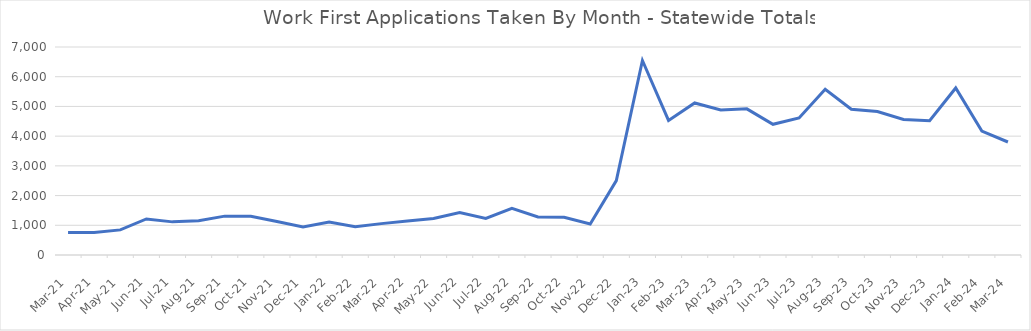
| Category | Series 0 |
|---|---|
| 2024-03-24 | 3803 |
| 2024-02-24 | 4172 |
| 2024-01-24 | 5621 |
| 2023-12-23 | 4519 |
| 2023-11-23 | 4563 |
| 2023-10-23 | 4827 |
| 2023-09-23 | 4905 |
| 2023-08-23 | 5577 |
| 2023-07-23 | 4613 |
| 2023-06-23 | 4398 |
| 2023-05-23 | 4918 |
| 2023-04-23 | 4882 |
| 2023-03-23 | 5117 |
| 2023-02-01 | 4530 |
| 2023-01-01 | 6546 |
| 2022-12-01 | 2505 |
| 2022-11-22 | 1044 |
| 2022-10-22 | 1268 |
| 2022-09-22 | 1279 |
| 2022-08-22 | 1568 |
| 2022-07-22 | 1228 |
| 2022-06-01 | 1433 |
| 2022-05-01 | 1230 |
| 2022-04-01 | 1142 |
| 2022-03-01 | 1056 |
| 2022-02-01 | 953 |
| 2022-01-01 | 1113 |
| 2021-12-02 | 940 |
| 2021-11-01 | 1127 |
| 2021-10-01 | 1301 |
| 2021-09-01 | 1308 |
| 2021-08-01 | 1156 |
| 2021-07-01 | 1115 |
| 2021-06-01 | 1214 |
| 2021-05-01 | 845 |
| 2021-04-01 | 759 |
| 2021-03-01 | 760 |